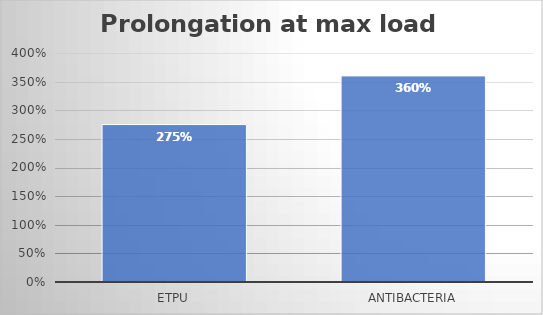
| Category | Average |
|---|---|
| eTPU | 2.75 |
| Antibacteria | 3.6 |